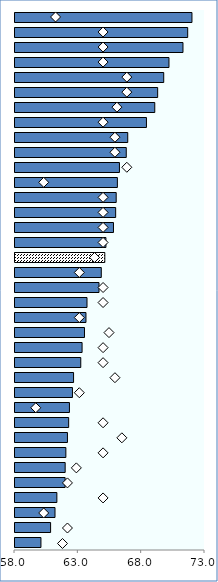
| Category | Effective |
|---|---|
| Korea | 71.971 |
| Mexico | 71.634 |
| Chile | 71.261 |
| Japan | 70.155 |
| Iceland | 69.741 |
| Israel | 69.263 |
| Portugal | 69.034 |
| New Zealand | 68.377 |
| Ireland | 66.9 |
| United States | 66.783 |
| Norway | 66.246 |
| Turkey | 66.083 |
| Switzerland | 65.989 |
| Canada | 65.948 |
| Sweden | 65.775 |
| Australia | 65.179 |
| OECD | 65.09 |
| Estonia | 64.813 |
| United Kingdom | 64.633 |
| Denmark | 63.685 |
| Hungary | 63.603 |
| Netherlands | 63.486 |
| Germany | 63.296 |
| Finland | 63.193 |
| Poland | 62.624 |
| Czech Republic | 62.537 |
| Slovenia | 62.298 |
| Spain | 62.237 |
| Italy | 62.141 |
| Austria | 62.016 |
| Latvia | 61.96 |
| Greece | 61.956 |
| Belgium | 61.305 |
| Luxembourg | 61.159 |
| Slovak Republic | 60.811 |
| France | 60.048 |